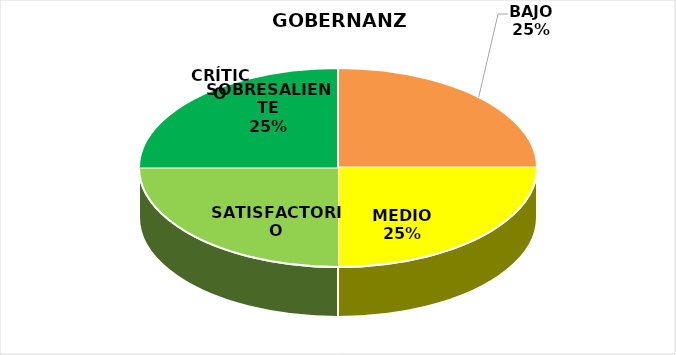
| Category | Series 1 | Series 0 |
|---|---|---|
| CRÍTICO | 0 | 5 |
| BAJO | 1 | 1 |
| MEDIO | 1 | 1 |
| SATISFACTORIO | 1 | 1 |
| SOBRESALIENTE | 1 | 6 |